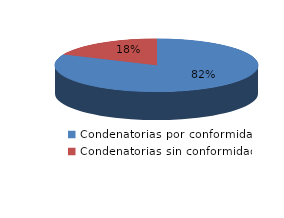
| Category | Series 0 |
|---|---|
| 0 | 214 |
| 1 | 48 |